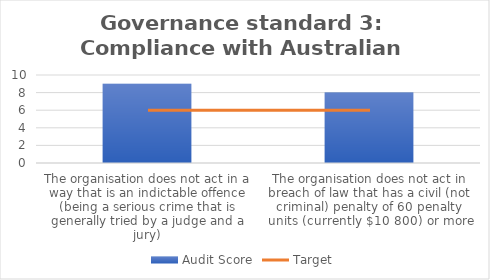
| Category | Audit Score |
|---|---|
| The organisation does not act in a way that is an indictable offence (being a serious crime that is generally tried by a judge and a jury) | 9 |
| The organisation does not act in breach of law that has a civil (not criminal) penalty of 60 penalty units (currently $10 800) or more | 8 |